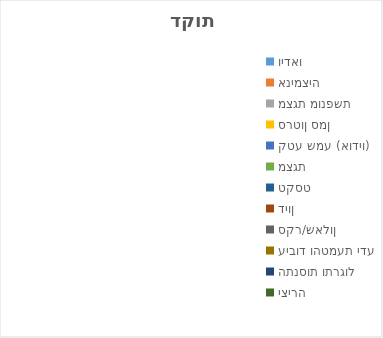
| Category | Series 0 |
|---|---|
| וידאו | 0 |
| אנימציה | 0 |
| מצגת מונפשת | 0 |
| סרטון סמן | 0 |
| קטע שמע (אודיו) | 0 |
| מצגת | 0 |
| טקסט | 0 |
| דיון | 0 |
| סקר/שאלון | 0 |
| עיבוד והטמעת ידע | 0 |
| התנסות ותרגול | 0 |
| יצירה | 0 |